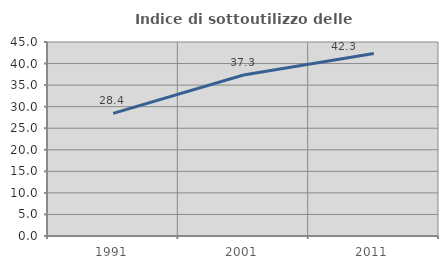
| Category | Indice di sottoutilizzo delle abitazioni  |
|---|---|
| 1991.0 | 28.446 |
| 2001.0 | 37.338 |
| 2011.0 | 42.32 |